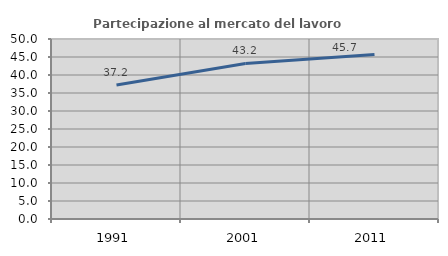
| Category | Partecipazione al mercato del lavoro  femminile |
|---|---|
| 1991.0 | 37.206 |
| 2001.0 | 43.217 |
| 2011.0 | 45.711 |